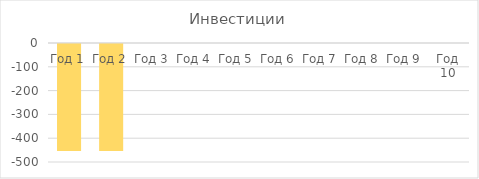
| Category | Инвестиции |
|---|---|
| Год 1 | -450 |
| Год 2 | -450 |
| Год 3 | 0 |
| Год 4 | 0 |
| Год 5 | 0 |
| Год 6 | 0 |
| Год 7 | 0 |
| Год 8 | 0 |
| Год 9 | 0 |
| Год 10 | 0 |